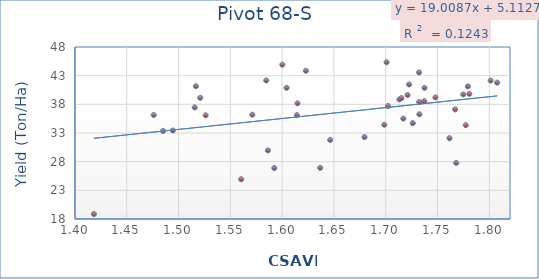
| Category | Series 0 |
|---|---|
| 1.780724 | 39.83 |
| 1.732211 | 43.563 |
| 1.737154 | 38.557 |
| 1.768068 | 27.79 |
| 1.779319 | 41.133 |
| 1.713265 | 38.86 |
| 1.767028 | 37.12 |
| 1.774878 | 39.733 |
| 1.715198 | 39.09 |
| 1.726179 | 34.72 |
| 1.70084 | 45.34 |
| 1.584616 | 42.167 |
| 1.614823 | 38.18 |
| 1.476019 | 36.147 |
| 1.586241 | 29.967 |
| 1.560497 | 24.933 |
| 1.418267 | 18.867 |
| 1.516746 | 41.167 |
| 1.777308 | 34.367 |
| 1.622951 | 43.853 |
| 1.49452 | 33.437 |
| 1.737442 | 40.877 |
| 1.732473 | 36.27 |
| 1.717035 | 35.523 |
| 1.807648 | 41.79 |
| 1.801273 | 42.147 |
| 1.721069 | 39.63 |
| 1.679487 | 32.297 |
| 1.7226 | 41.467 |
| 1.732347 | 38.41 |
| 1.614262 | 36.117 |
| 1.636763 | 26.927 |
| 1.702229 | 37.697 |
| 1.592466 | 26.893 |
| 1.526163 | 36.093 |
| 1.604298 | 40.88 |
| 1.515604 | 37.467 |
| 1.600196 | 44.913 |
| 1.485007 | 33.35 |
| 1.748036 | 39.217 |
| 1.646417 | 31.79 |
| 1.520935 | 39.14 |
| 1.698662 | 34.44 |
| 1.57121 | 36.193 |
| 1.761569 | 32.093 |